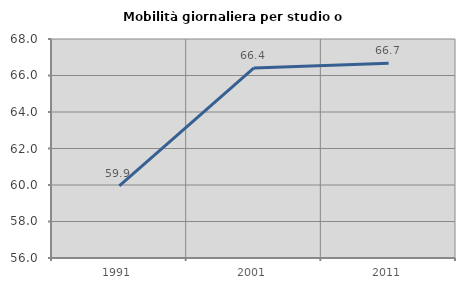
| Category | Mobilità giornaliera per studio o lavoro |
|---|---|
| 1991.0 | 59.949 |
| 2001.0 | 66.414 |
| 2011.0 | 66.667 |